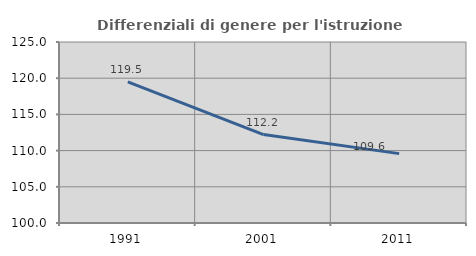
| Category | Differenziali di genere per l'istruzione superiore |
|---|---|
| 1991.0 | 119.495 |
| 2001.0 | 112.218 |
| 2011.0 | 109.583 |